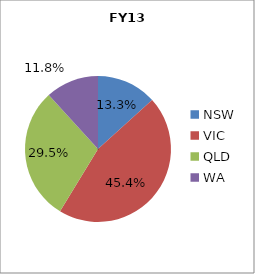
| Category | FY13 |
|---|---|
| NSW | 0.133 |
| VIC | 0.454 |
| QLD | 0.295 |
| WA | 0.118 |